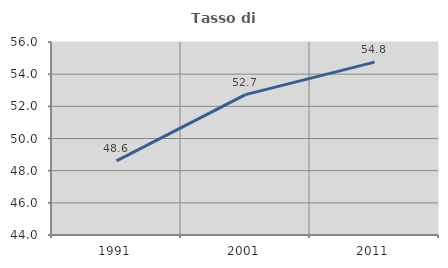
| Category | Tasso di occupazione   |
|---|---|
| 1991.0 | 48.604 |
| 2001.0 | 52.73 |
| 2011.0 | 54.751 |